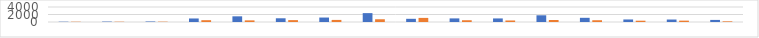
| Category | Series 0 | Series 1 |
|---|---|---|
| 7:00-8:00 | 76 | 72 |
| 8:00-9:00 | 108 | 76 |
| 9:00-10:00 | 132 | 84 |
| 10:00-11:00 | 940 | 484 |
| 11:00-12:00 | 1512 | 436 |
| 12:00-13:00 | 992 | 500 |
| 13:00-14:00 | 1188 | 556 |
| 14:00-15:00 | 2368 | 732 |
| 15:00-16:00 | 852 | 1092 |
| 16:00-17:00 | 960 | 472 |
| 17:00-18:00 | 952 | 408 |
| 18:00-19:00 | 1788 | 532 |
| 19:00-20:00 | 1116 | 472 |
| 20:00-21:00 | 676 | 348 |
| 21:00-22:00 | 660 | 364 |
| 22:00-23:00 | 556 | 172 |